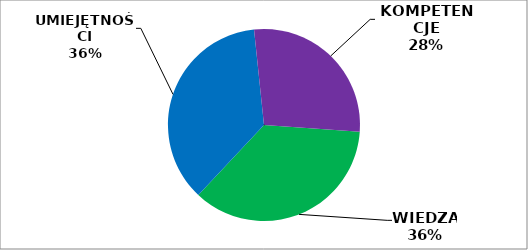
| Category | Series 0 |
|---|---|
| WIEDZA | 389 |
| UMIEJĘTNOŚCI | 394 |
| KOMPETENCJE | 301 |